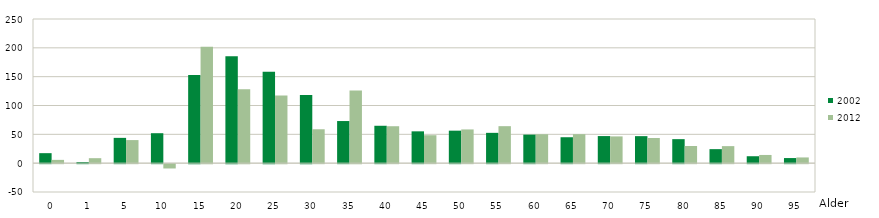
| Category | 2002 | 2012 |
|---|---|---|
| 0.0 | 17.345 | 5.706 |
| 1.0 | 1.822 | 8.641 |
| 5.0 | 43.87 | 40.034 |
| 10.0 | 51.945 | -7.465 |
| 15.0 | 152.925 | 201.861 |
| 20.0 | 185.508 | 128.067 |
| 25.0 | 158.673 | 117.417 |
| 30.0 | 118.119 | 58.784 |
| 35.0 | 73.055 | 126.094 |
| 40.0 | 64.848 | 64.068 |
| 45.0 | 55.192 | 48.488 |
| 50.0 | 56.365 | 58.483 |
| 55.0 | 52.582 | 64.16 |
| 60.0 | 49.507 | 50.162 |
| 65.0 | 44.971 | 50.288 |
| 70.0 | 46.988 | 46.414 |
| 75.0 | 46.871 | 43.642 |
| 80.0 | 41.654 | 29.784 |
| 85.0 | 24.321 | 29.545 |
| 90.0 | 12.026 | 14.224 |
| 95.0 | 8.857 | 9.931 |